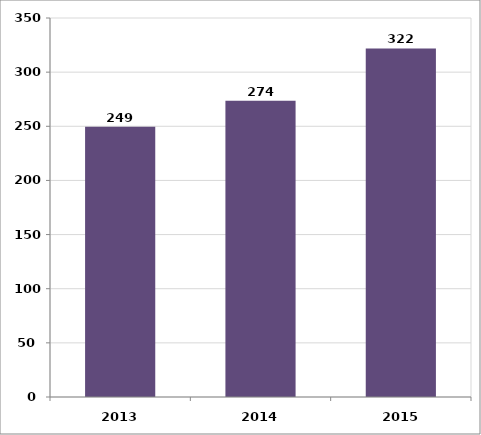
| Category | Series 0 |
|---|---|
| 2013.0 | 249.466 |
| 2014.0 | 273.586 |
| 2015.0 | 321.876 |